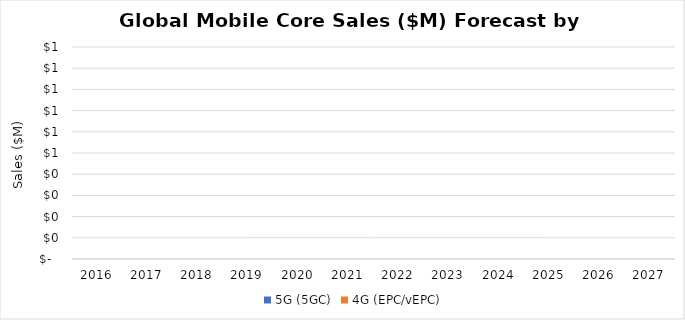
| Category | 5G (5GC) | 4G (EPC/vEPC) |
|---|---|---|
| 2016.0 | 0 | 0 |
| 2017.0 | 0 | 0 |
| 2018.0 | 0 | 0 |
| 2019.0 | 0 | 0 |
| 2020.0 | 0 | 0 |
| 2021.0 | 0 | 0 |
| 2022.0 | 0 | 0 |
| 2023.0 | 0 | 0 |
| 2024.0 | 0 | 0 |
| 2025.0 | 0 | 0 |
| 2026.0 | 0 | 0 |
| 2027.0 | 0 | 0 |